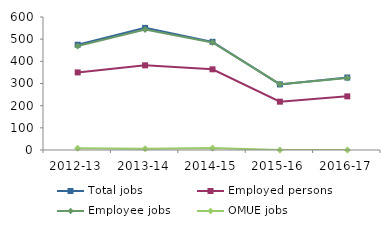
| Category | Total jobs | Employed persons | Employee jobs | OMUE jobs |
|---|---|---|---|---|
| 2012-13 | 475 | 350 | 469 | 8 |
| 2013-14 | 551 | 382 | 544 | 6 |
| 2014-15 | 488 | 364 | 485 | 9 |
| 2015-16 | 296 | 218 | 297 | 0 |
| 2016-17 | 327 | 242 | 325 | 0 |